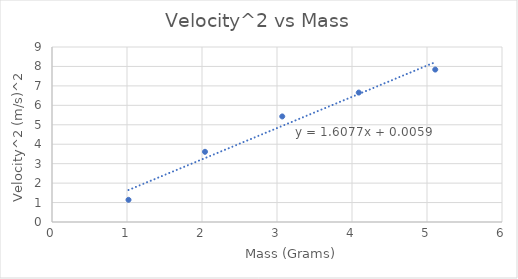
| Category | Velocity^2 (m/s)^2 |
|---|---|
| 1.02 | 1.141 |
| 2.04 | 3.61 |
| 3.07 | 5.429 |
| 4.09 | 6.656 |
| 5.11 | 7.84 |